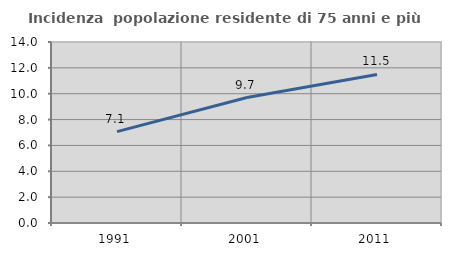
| Category | Incidenza  popolazione residente di 75 anni e più |
|---|---|
| 1991.0 | 7.07 |
| 2001.0 | 9.706 |
| 2011.0 | 11.486 |